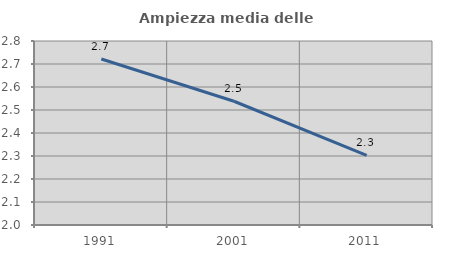
| Category | Ampiezza media delle famiglie |
|---|---|
| 1991.0 | 2.722 |
| 2001.0 | 2.538 |
| 2011.0 | 2.303 |